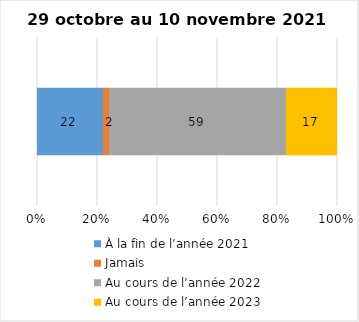
| Category | À la fin de l’année 2021 | Jamais | Au cours de l’année 2022 | Au cours de l’année 2023 |
|---|---|---|---|---|
| 0 | 22 | 2 | 59 | 17 |